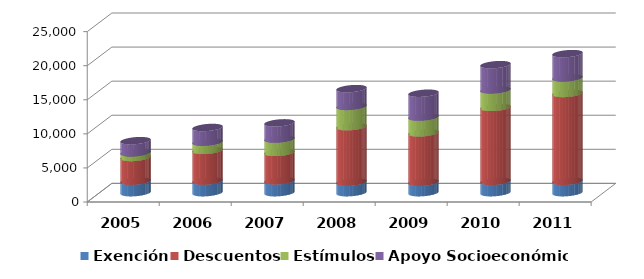
| Category | Exención | Descuentos | Estímulos | Apoyo Socioeconómico |
|---|---|---|---|---|
| 2005.0 | 1690 | 3481 | 686 | 1778 |
| 2006.0 | 1709 | 4500 | 1193 | 2167 |
| 2007.0 | 1744 | 4167 | 1945 | 2392 |
| 2008.0 | 1560 | 8131 | 2962 | 2620 |
| 2009.0 | 1539 | 7241 | 2305 | 3513 |
| 2010.0 | 1668 | 10847 | 2554 | 3722 |
| 2011.0 | 1679 | 12887 | 2265 | 3577 |